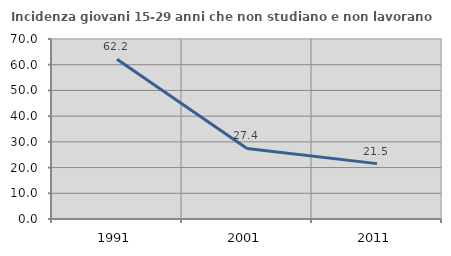
| Category | Incidenza giovani 15-29 anni che non studiano e non lavorano  |
|---|---|
| 1991.0 | 62.162 |
| 2001.0 | 27.447 |
| 2011.0 | 21.534 |